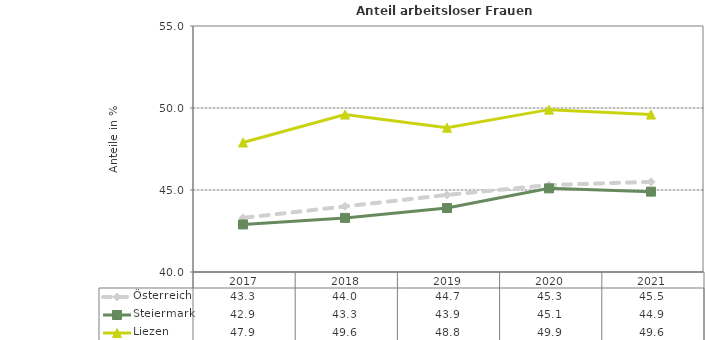
| Category | Österreich | Steiermark | Liezen |
|---|---|---|---|
| 2021.0 | 45.5 | 44.9 | 49.6 |
| 2020.0 | 45.3 | 45.1 | 49.9 |
| 2019.0 | 44.7 | 43.9 | 48.8 |
| 2018.0 | 44 | 43.3 | 49.6 |
| 2017.0 | 43.3 | 42.9 | 47.9 |